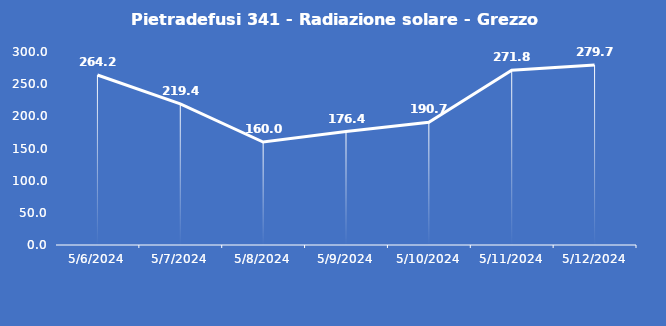
| Category | Pietradefusi 341 - Radiazione solare - Grezzo (W/m2) |
|---|---|
| 5/6/24 | 264.2 |
| 5/7/24 | 219.4 |
| 5/8/24 | 160 |
| 5/9/24 | 176.4 |
| 5/10/24 | 190.7 |
| 5/11/24 | 271.8 |
| 5/12/24 | 279.7 |